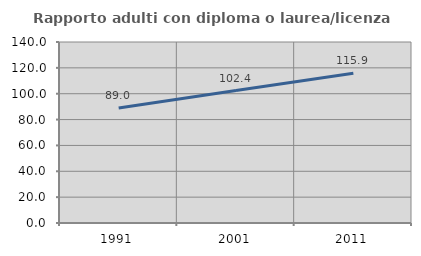
| Category | Rapporto adulti con diploma o laurea/licenza media  |
|---|---|
| 1991.0 | 88.988 |
| 2001.0 | 102.423 |
| 2011.0 | 115.861 |